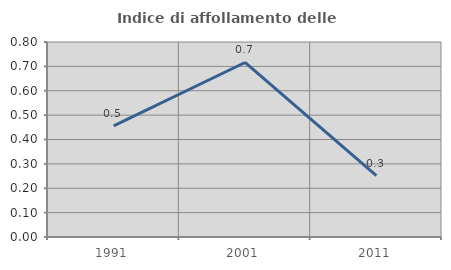
| Category | Indice di affollamento delle abitazioni  |
|---|---|
| 1991.0 | 0.456 |
| 2001.0 | 0.716 |
| 2011.0 | 0.252 |